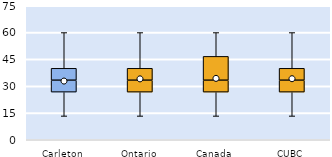
| Category | 25th | 50th | 75th |
|---|---|---|---|
| Carleton | 26.667 | 6.667 | 6.667 |
| Ontario | 26.667 | 6.667 | 6.667 |
| Canada | 26.667 | 6.667 | 13.333 |
| CUBC | 26.667 | 6.667 | 6.667 |